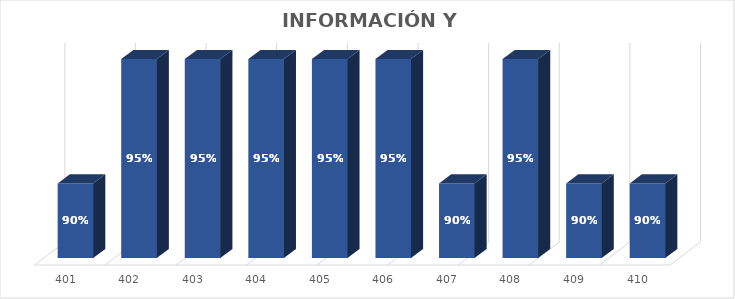
| Category | % Avance |
|---|---|
| 401.0 | 0.9 |
| 402.0 | 0.95 |
| 403.0 | 0.95 |
| 404.0 | 0.95 |
| 405.0 | 0.95 |
| 406.0 | 0.95 |
| 407.0 | 0.9 |
| 408.0 | 0.95 |
| 409.0 | 0.9 |
| 410.0 | 0.9 |